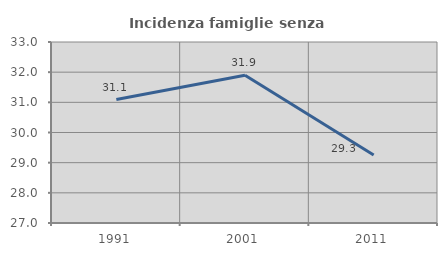
| Category | Incidenza famiglie senza nuclei |
|---|---|
| 1991.0 | 31.092 |
| 2001.0 | 31.897 |
| 2011.0 | 29.252 |